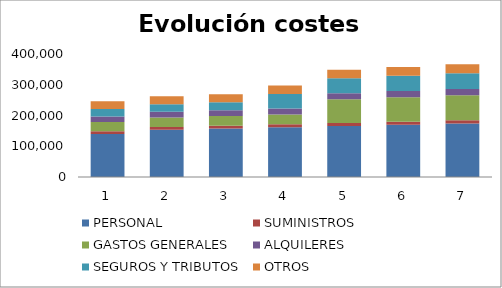
| Category | PERSONAL | SUMINISTROS | GASTOS GENERALES | ALQUILERES | SEGUROS Y TRIBUTOS | OTROS |
|---|---|---|---|---|---|---|
| 0 | 140000 | 9000 | 30000 | 18000 | 24000 | 25000 |
| 1 | 153750 | 9225 | 30750 | 18450 | 24600 | 25625 |
| 2 | 157593.75 | 9455.625 | 31518.75 | 18911.25 | 25215 | 26265.625 |
| 3 | 161533.594 | 9692.016 | 32306.719 | 19384.031 | 47383.187 | 26922.266 |
| 4 | 165571.934 | 9934.316 | 77266.902 | 19868.632 | 48567.767 | 27595.322 |
| 5 | 169711.232 | 10182.674 | 79198.575 | 20365.348 | 49781.961 | 28285.205 |
| 6 | 173954.013 | 10437.241 | 81178.539 | 20874.482 | 51026.51 | 28992.335 |